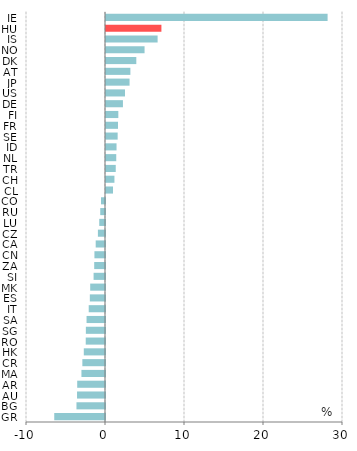
| Category | Series 2 |
|---|---|
| GR | -6.424 |
| BG | -3.612 |
| AU | -3.54 |
| AR | -3.519 |
| MA | -2.983 |
| CR | -2.866 |
| HK | -2.684 |
| RO | -2.439 |
| SG | -2.422 |
| SA | -2.336 |
| IT | -2.062 |
| ES | -1.92 |
| MK | -1.874 |
| SI | -1.444 |
| ZA | -1.366 |
| CN | -1.338 |
| CA | -1.178 |
| CZ | -0.899 |
| LU | -0.728 |
| RU | -0.603 |
| CO | -0.507 |
| CL | 0.885 |
| CH | 1.068 |
| TR | 1.234 |
| NL | 1.297 |
| ID | 1.333 |
| SE | 1.475 |
| FR | 1.521 |
| FI | 1.56 |
| DE | 2.144 |
| US | 2.402 |
| JP | 2.983 |
| AT | 3.087 |
| DK | 3.837 |
| NO | 4.882 |
| IS | 6.533 |
| HU | 7.014 |
| IE | 28.05 |